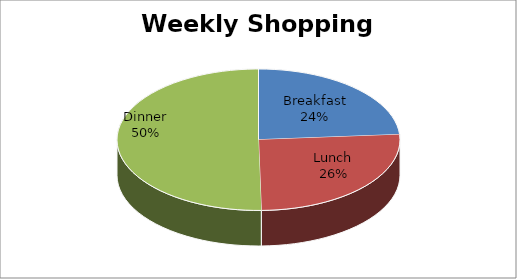
| Category | Series 0 |
|---|---|
| Breakfast | 17 |
| Lunch | 18.45 |
| Dinner | 35.9 |